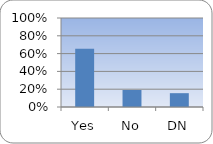
| Category | Series 0 |
|---|---|
| Yes | 0.654 |
| No | 0.191 |
| DN | 0.155 |